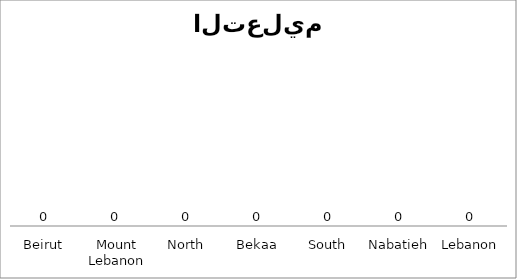
| Category | 10 |
|---|---|
| Beirut | 0 |
| Mount Lebanon | 0 |
| North | 0 |
| Bekaa | 0 |
| South | 0 |
| Nabatieh | 0 |
| Lebanon | 0 |